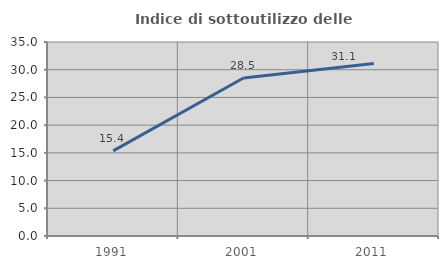
| Category | Indice di sottoutilizzo delle abitazioni  |
|---|---|
| 1991.0 | 15.352 |
| 2001.0 | 28.502 |
| 2011.0 | 31.101 |